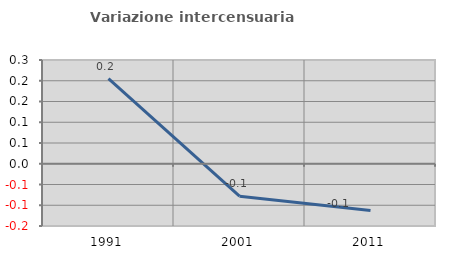
| Category | Variazione intercensuaria annua |
|---|---|
| 1991.0 | 0.205 |
| 2001.0 | -0.078 |
| 2011.0 | -0.112 |